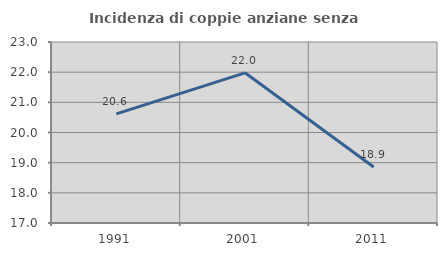
| Category | Incidenza di coppie anziane senza figli  |
|---|---|
| 1991.0 | 20.619 |
| 2001.0 | 21.978 |
| 2011.0 | 18.857 |